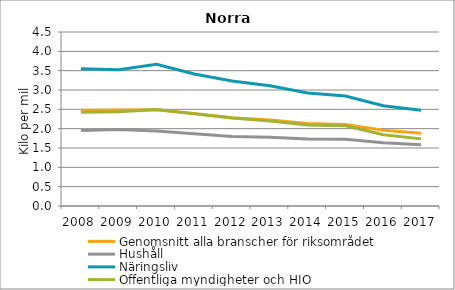
| Category | Genomsnitt alla branscher för riksområdet | Hushåll | Näringsliv | Offentliga myndigheter och HIO |
|---|---|---|---|---|
| 2008 | 2.479 | 1.951 | 3.551 | 2.423 |
| 2009 | 2.48 | 1.978 | 3.522 | 2.439 |
| 2010 | 2.49 | 1.939 | 3.664 | 2.498 |
| 2011 | 2.394 | 1.868 | 3.413 | 2.383 |
| 2012 | 2.283 | 1.799 | 3.233 | 2.277 |
| 2013 | 2.222 | 1.775 | 3.111 | 2.195 |
| 2014 | 2.136 | 1.735 | 2.921 | 2.094 |
| 2015 | 2.106 | 1.725 | 2.846 | 2.076 |
| 2016 | 1.962 | 1.639 | 2.594 | 1.843 |
| 2017 | 1.883 | 1.582 | 2.475 | 1.736 |